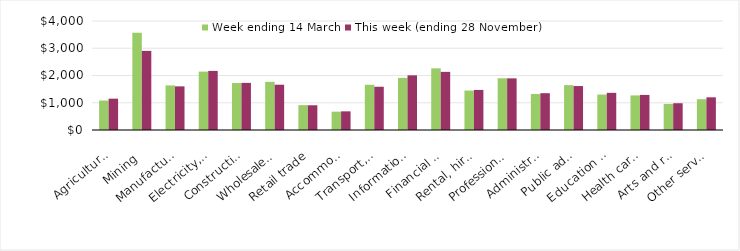
| Category | Week ending 14 March | This week (ending 28 November) |
|---|---|---|
| Agriculture, forestry and fishing | 1080.24 | 1150.22 |
| Mining | 3567.29 | 2903.62 |
| Manufacturing | 1636.56 | 1601.18 |
| Electricity, gas, water and waste services | 2142.41 | 2168.4 |
| Construction | 1723.58 | 1729.4 |
| Wholesale trade | 1767 | 1661.92 |
| Retail trade | 912.64 | 907.49 |
| Accommodation and food services | 672.71 | 684.32 |
| Transport, postal and warehousing | 1660.31 | 1587.22 |
| Information media and telecommunications | 1913.95 | 2006.64 |
| Financial and insurance services | 2262.31 | 2133.44 |
| Rental, hiring and real estate services | 1446.97 | 1470.43 |
| Professional, scientific and technical services | 1897.78 | 1895.11 |
| Administrative and support services | 1321.61 | 1350.76 |
| Public administration and safety | 1646.68 | 1612.56 |
| Education and training | 1301.03 | 1363.16 |
| Health care and social assistance | 1270.07 | 1287.37 |
| Arts and recreation services | 958.68 | 982.73 |
| Other services | 1130.38 | 1199.16 |